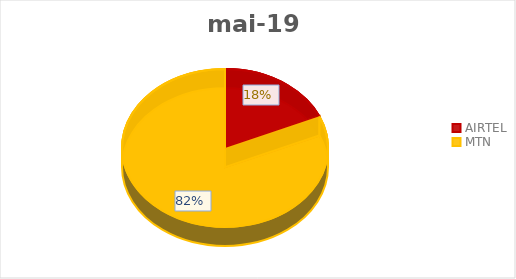
| Category | mai-19 |
|---|---|
| AIRTEL | 248.399 |
| MTN | 1100.065 |